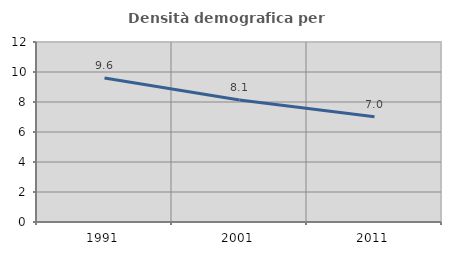
| Category | Densità demografica |
|---|---|
| 1991.0 | 9.601 |
| 2001.0 | 8.134 |
| 2011.0 | 7.016 |